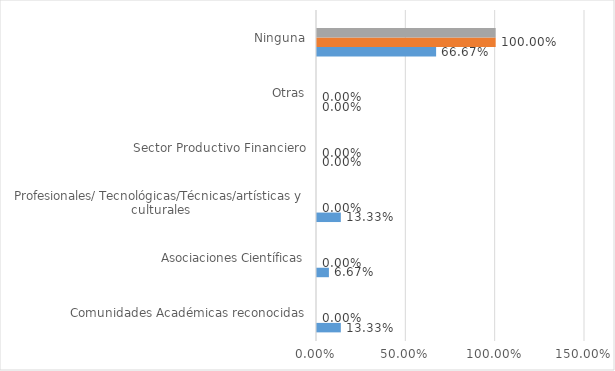
| Category | Series 0 | Series 1 | Series 2 | Series 3 |
|---|---|---|---|---|
| Comunidades Académicas reconocidas | 0.133 | 0 | 0 | 0 |
| Asociaciones Científicas | 0.067 | 0 | 0 | 0 |
| Profesionales/ Tecnológicas/Técnicas/artísticas y culturales | 0.133 | 0 | 0 | 0 |
| Sector Productivo Financiero | 0 | 0 | 0 | 0 |
| Otras | 0 | 0 | 0 | 0 |
| Ninguna | 0.667 | 1 | 1 | 0 |